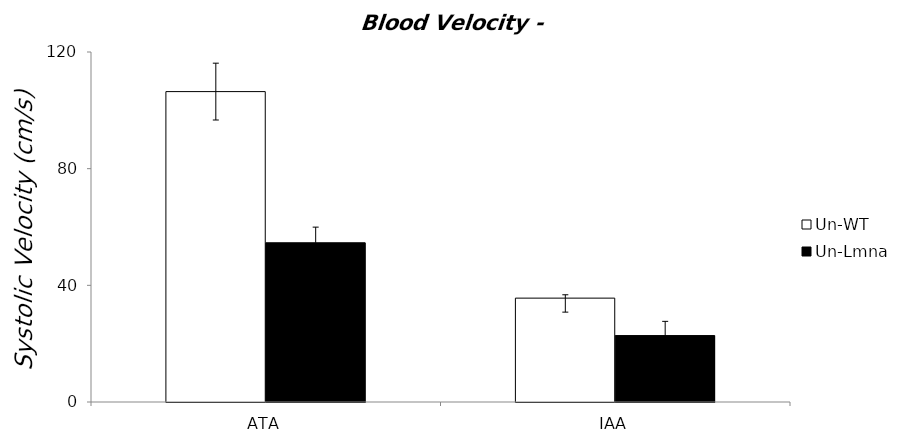
| Category | Un-WT | Un-Lmna |
|---|---|---|
| 0 | 106.425 | 54.59 |
| 1 | 35.614 | 22.775 |